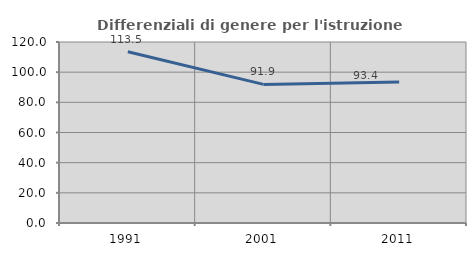
| Category | Differenziali di genere per l'istruzione superiore |
|---|---|
| 1991.0 | 113.539 |
| 2001.0 | 91.892 |
| 2011.0 | 93.446 |